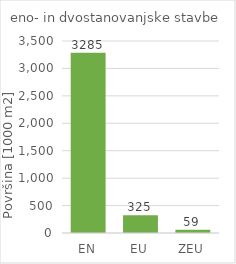
| Category | Series 0 |
|---|---|
| EN | 3285154.6 |
| EU | 324978.8 |
| ZEU | 58577.6 |